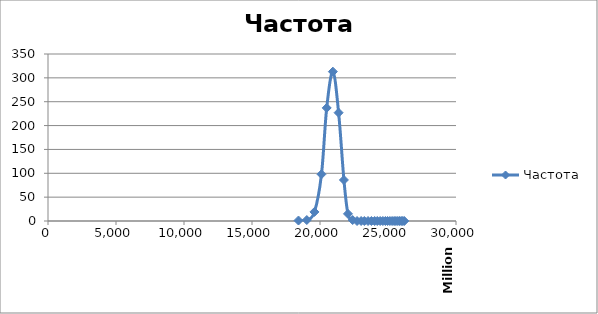
| Category | Частота |
|---|---|
| 18418105146.0 | 1 |
| 19029026541.0 | 2 |
| 19590923697.0 | 19 |
| 20108828356.0 | 98 |
| 20492822336.0 | 237 |
| 20947161394.0 | 313 |
| 21367892879.0 | 227 |
| 21758223778.0 | 86 |
| 22055207813.0 | 15 |
| 22401438724.0 | 2 |
| 22723888659.0 | 0 |
| 23024686015.0 | 0 |
| 23261097691.0 | 0 |
| 23530170925.0 | 0 |
| 23781987696.0 | 0 |
| 24017987153.0 | 0 |
| 24210348438.0 | 0 |
| 24422846806.0 | 0 |
| 24622509539.0 | 0 |
| 24810314557.0 | 0 |
| 24969567370.0 | 0 |
| 25139478522.0 | 0 |
| 25299567952.0 | 0 |
| 25450493139.0 | 0 |
| 25584201776.0 | 0 |
| 25721102147.0 | 0 |
| 25850213486.0 | 0 |
| 25971960283.0 | 0 |
| 26085529346.0 | 0 |
| 26195907445.0 | 0 |